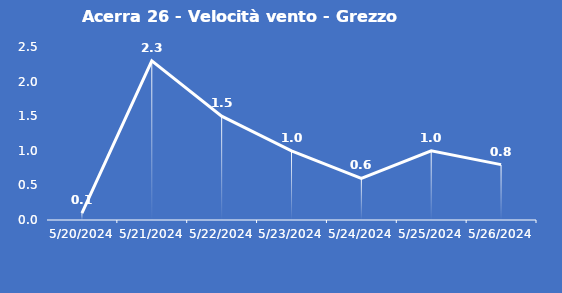
| Category | Acerra 26 - Velocità vento - Grezzo (m/s) |
|---|---|
| 5/20/24 | 0.1 |
| 5/21/24 | 2.3 |
| 5/22/24 | 1.5 |
| 5/23/24 | 1 |
| 5/24/24 | 0.6 |
| 5/25/24 | 1 |
| 5/26/24 | 0.8 |